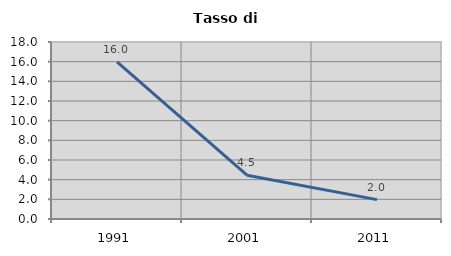
| Category | Tasso di disoccupazione   |
|---|---|
| 1991.0 | 15.976 |
| 2001.0 | 4.459 |
| 2011.0 | 1.97 |